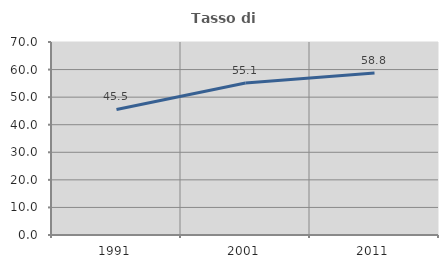
| Category | Tasso di occupazione   |
|---|---|
| 1991.0 | 45.533 |
| 2001.0 | 55.115 |
| 2011.0 | 58.8 |